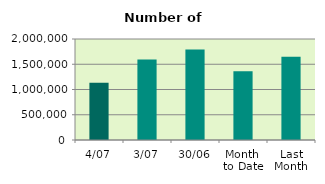
| Category | Series 0 |
|---|---|
| 4/07 | 1134638 |
| 3/07 | 1591772 |
| 30/06 | 1792482 |
| Month 
to Date | 1363205 |
| Last
Month | 1646651.818 |